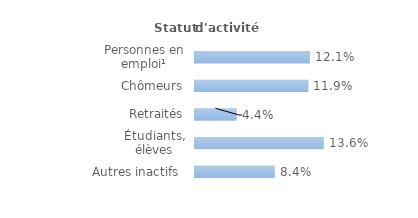
| Category | Series 0 |
|---|---|
| Personnes en emploi¹ | 0.121 |
| Chômeurs | 0.119 |
| Retraités | 0.044 |
| Étudiants, élèves | 0.136 |
| Autres inactifs  | 0.084 |